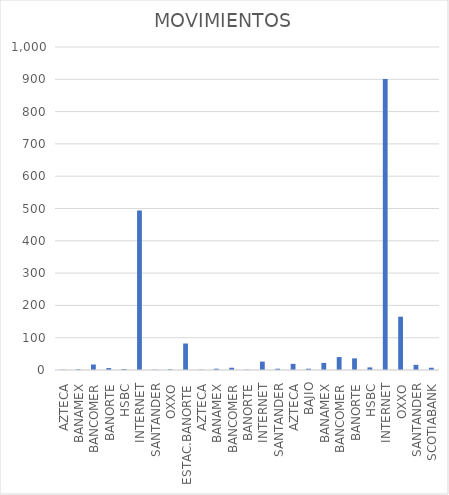
| Category | MOVIMIENTOS |
|---|---|
| AZTECA | 1 |
| BANAMEX | 2 |
| BANCOMER | 17 |
| BANORTE | 6 |
| HSBC | 3 |
| INTERNET | 494 |
| SANTANDER | 1 |
| OXXO | 2 |
| ESTAC.BANORTE | 82 |
| AZTECA | 1 |
| BANAMEX | 4 |
| BANCOMER | 7 |
| BANORTE | 1 |
| INTERNET | 26 |
| SANTANDER | 4 |
| AZTECA | 19 |
| BAJIO | 4 |
| BANAMEX | 22 |
| BANCOMER | 40 |
| BANORTE | 36 |
| HSBC | 8 |
| INTERNET | 901 |
| OXXO | 165 |
| SANTANDER | 16 |
| SCOTIABANK | 7 |